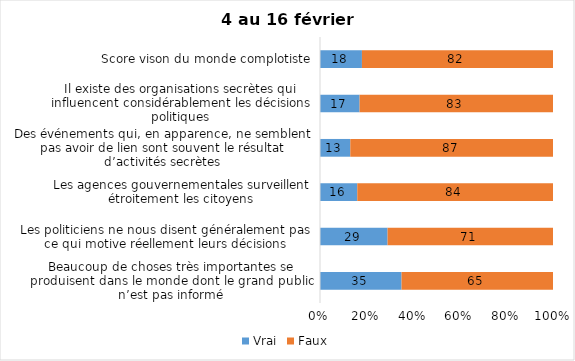
| Category | Vrai | Faux |
|---|---|---|
| Beaucoup de choses très importantes se produisent dans le monde dont le grand public n’est pas informé | 35 | 65 |
| Les politiciens ne nous disent généralement pas ce qui motive réellement leurs décisions | 29 | 71 |
| Les agences gouvernementales surveillent étroitement les citoyens | 16 | 84 |
| Des événements qui, en apparence, ne semblent pas avoir de lien sont souvent le résultat d’activités secrètes | 13 | 87 |
| Il existe des organisations secrètes qui influencent considérablement les décisions politiques | 17 | 83 |
| Score vison du monde complotiste | 18 | 82 |